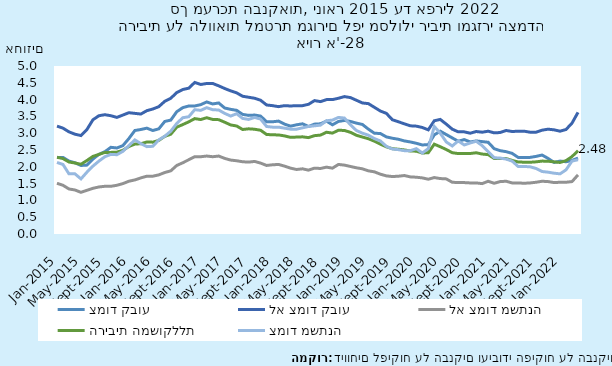
| Category | צמוד קבוע | לא צמוד קבוע | לא צמוד משתנה | הריבית המשוקללת | צמוד משתנה |
|---|---|---|---|---|---|
| 2015-01-31 | 2.28 | 3.21 | 1.51 | 2.284 | 2.13 |
| 2015-02-28 | 2.28 | 3.15 | 1.45 | 2.245 | 2.07 |
| 2015-03-31 | 2.17 | 3.04 | 1.34 | 2.142 | 1.79 |
| 2015-04-30 | 2.12 | 2.97 | 1.31 | 2.113 | 1.79 |
| 2015-05-31 | 2.04 | 2.93 | 1.24 | 2.076 | 1.64 |
| 2015-06-30 | 2.05 | 3.11 | 1.3 | 2.188 | 1.84 |
| 2015-07-31 | 2.23 | 3.4 | 1.36 | 2.31 | 2.02 |
| 2015-08-31 | 2.37 | 3.52 | 1.4 | 2.369 | 2.17 |
| 2015-09-30 | 2.45 | 3.55 | 1.42 | 2.427 | 2.3 |
| 2015-10-31 | 2.58 | 3.52 | 1.42 | 2.429 | 2.37 |
| 2015-11-30 | 2.56 | 3.47 | 1.45 | 2.436 | 2.36 |
| 2015-12-31 | 2.63 | 3.54 | 1.5 | 2.491 | 2.46 |
| 2016-01-31 | 2.84 | 3.61 | 1.57 | 2.603 | 2.63 |
| 2016-02-29 | 3.08 | 3.59 | 1.61 | 2.676 | 2.8 |
| 2016-03-31 | 3.11 | 3.57 | 1.67 | 2.686 | 2.69 |
| 2016-04-30 | 3.15 | 3.67 | 1.72 | 2.738 | 2.6 |
| 2016-05-31 | 3.08 | 3.72 | 1.72 | 2.734 | 2.61 |
| 2016-06-30 | 3.13 | 3.79 | 1.76 | 2.786 | 2.8 |
| 2016-07-31 | 3.35 | 3.95 | 1.83 | 2.906 | 2.91 |
| 2016-08-31 | 3.39 | 4.04 | 1.88 | 2.97 | 3.06 |
| 2016-09-30 | 3.64 | 4.21 | 2.04 | 3.18 | 3.29 |
| 2016-10-31 | 3.76 | 4.3 | 2.12 | 3.256 | 3.46 |
| 2016-11-30 | 3.81 | 4.34 | 2.21 | 3.338 | 3.49 |
| 2016-12-31 | 3.81 | 4.51 | 2.3 | 3.434 | 3.7 |
| 2017-01-31 | 3.85 | 4.45 | 2.3 | 3.407 | 3.68 |
| 2017-02-28 | 3.93 | 4.48 | 2.32 | 3.461 | 3.76 |
| 2017-03-31 | 3.87 | 4.48 | 2.3 | 3.41 | 3.7 |
| 2017-04-30 | 3.9 | 4.41 | 2.32 | 3.403 | 3.69 |
| 2017-05-31 | 3.75 | 4.33 | 2.25 | 3.327 | 3.59 |
| 2017-06-30 | 3.71 | 4.26 | 2.2 | 3.246 | 3.51 |
| 2017-07-31 | 3.68 | 4.2 | 2.18 | 3.214 | 3.58 |
| 2017-08-31 | 3.56 | 4.1 | 2.15 | 3.11 | 3.44 |
| 2017-09-30 | 3.53 | 4.07 | 2.14 | 3.13 | 3.41 |
| 2017-10-31 | 3.54 | 4.04 | 2.16 | 3.118 | 3.47 |
| 2017-11-30 | 3.51 | 3.98 | 2.11 | 3.088 | 3.42 |
| 2017-12-31 | 3.34 | 3.84 | 2.04 | 2.962 | 3.2 |
| 2018-01-31 | 3.34 | 3.82 | 2.06 | 2.952 | 3.18 |
| 2018-02-28 | 3.36 | 3.79 | 2.07 | 2.948 | 3.18 |
| 2018-03-31 | 3.27 | 3.82 | 2.02 | 2.92 | 3.15 |
| 2018-04-30 | 3.21 | 3.81 | 1.96 | 2.876 | 3.12 |
| 2018-05-31 | 3.25 | 3.82 | 1.92 | 2.885 | 3.12 |
| 2018-06-30 | 3.28 | 3.82 | 1.94 | 2.892 | 3.16 |
| 2018-07-31 | 3.2 | 3.86 | 1.9 | 2.868 | 3.2 |
| 2018-08-31 | 3.27 | 3.97 | 1.96 | 2.927 | 3.22 |
| 2018-09-30 | 3.28 | 3.94 | 1.95 | 2.944 | 3.24 |
| 2018-10-31 | 3.36 | 4 | 1.99 | 3.029 | 3.37 |
| 2018-11-30 | 3.25 | 4 | 1.96 | 3.003 | 3.39 |
| 2018-12-31 | 3.35 | 4.04 | 2.07 | 3.089 | 3.47 |
| 2019-01-31 | 3.38 | 4.09 | 2.05 | 3.081 | 3.45 |
| 2019-02-28 | 3.35 | 4.06 | 2.01 | 3.026 | 3.25 |
| 2019-03-31 | 3.3 | 3.98 | 1.97 | 2.938 | 3.08 |
| 2019-04-30 | 3.26 | 3.9 | 1.94 | 2.886 | 3 |
| 2019-05-31 | 3.12 | 3.88 | 1.88 | 2.835 | 2.94 |
| 2019-06-30 | 3 | 3.77 | 1.85 | 2.762 | 2.84 |
| 2019-07-31 | 2.99 | 3.66 | 1.78 | 2.673 | 2.77 |
| 2019-08-31 | 2.89 | 3.59 | 1.73 | 2.595 | 2.61 |
| 2019-09-30 | 2.85 | 3.4 | 1.71 | 2.539 | 2.53 |
| 2019-10-31 | 2.82 | 3.34 | 1.72 | 2.523 | 2.51 |
| 2019-11-30 | 2.77 | 3.28 | 1.74 | 2.503 | 2.48 |
| 2019-12-31 | 2.74 | 3.22 | 1.7 | 2.47 | 2.48 |
| 2020-01-31 | 2.7 | 3.21 | 1.69 | 2.465 | 2.54 |
| 2020-02-29 | 2.65 | 3.17 | 1.67 | 2.41 | 2.41 |
| 2020-03-31 | 2.66 | 3.1 | 1.63 | 2.42 | 2.54 |
| 2020-04-30 | 2.95 | 3.37 | 1.68 | 2.673 | 3.2 |
| 2020-05-31 | 3.06 | 3.41 | 1.65 | 2.597 | 3 |
| 2020-06-30 | 2.96 | 3.27 | 1.64 | 2.514 | 2.74 |
| 2020-07-31 | 2.86 | 3.12 | 1.54 | 2.419 | 2.62 |
| 2020-08-31 | 2.76 | 3.04 | 1.53 | 2.394 | 2.77 |
| 2020-09-30 | 2.81 | 3.04 | 1.53 | 2.394 | 2.65 |
| 2020-10-31 | 2.74 | 3 | 1.52 | 2.396 | 2.71 |
| 2020-11-30 | 2.77 | 3.05 | 1.52 | 2.418 | 2.76 |
| 2020-12-31 | 2.75 | 3.03 | 1.5 | 2.379 | 2.63 |
| 2021-01-31 | 2.73 | 3.06 | 1.57 | 2.363 | 2.45 |
| 2021-02-28 | 2.54 | 3.01 | 1.51 | 2.248 | 2.27 |
| 2021-03-31 | 2.48 | 3.02 | 1.56 | 2.247 | 2.26 |
| 2021-04-30 | 2.45 | 3.08 | 1.57 | 2.245 | 2.23 |
| 2021-05-31 | 2.4 | 3.05 | 1.52 | 2.19 | 2.17 |
| 2021-06-30 | 2.28 | 3.06 | 1.52 | 2.143 | 2.01 |
| 2021-07-31 | 2.28 | 3.06 | 1.51 | 2.137 | 2.01 |
| 2021-08-31 | 2.28 | 3.03 | 1.52 | 2.135 | 2 |
| 2021-09-30 | 2.31 | 3.03 | 1.54 | 2.148 | 1.95 |
| 2021-10-31 | 2.35 | 3.09 | 1.57 | 2.17 | 1.86 |
| 2021-11-30 | 2.25 | 3.12 | 1.56 | 2.166 | 1.84 |
| 2021-12-31 | 2.13 | 3.1 | 1.53 | 2.147 | 1.81 |
| 2022-01-31 | 2.17 | 3.06 | 1.54 | 2.129 | 1.79 |
| 2022-02-28 | 2.15 | 3.11 | 1.54 | 2.184 | 1.91 |
| 2022-03-31 | 2.19 | 3.3 | 1.56 | 2.304 | 2.17 |
| 2022-04-30 | 2.26 | 3.62 | 1.76 | 2.478 | 2.21 |